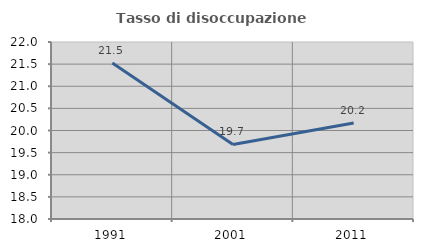
| Category | Tasso di disoccupazione giovanile  |
|---|---|
| 1991.0 | 21.525 |
| 2001.0 | 19.685 |
| 2011.0 | 20.168 |